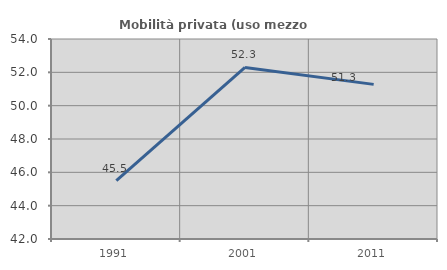
| Category | Mobilità privata (uso mezzo privato) |
|---|---|
| 1991.0 | 45.498 |
| 2001.0 | 52.291 |
| 2011.0 | 51.278 |